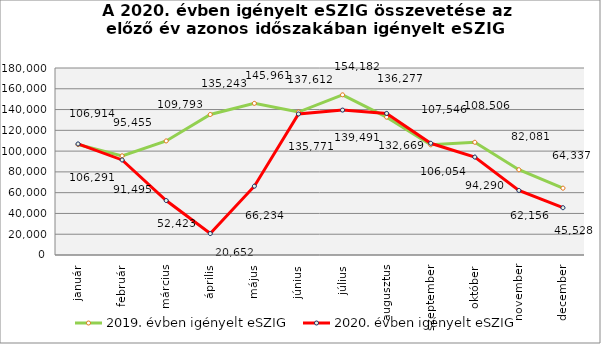
| Category | 2019. évben igényelt eSZIG | 2020. évben igényelt eSZIG |
|---|---|---|
| január | 106291 | 106914 |
| február | 95455 | 91495 |
| március | 109793 | 52423 |
| április | 135243 | 20652 |
| május | 145961 | 66234 |
| június | 137612 | 135771 |
| július | 154182 | 139491 |
| augusztus | 132669 | 136277 |
| szeptember | 106054 | 107546 |
| október | 108506 | 94290 |
| november | 82081 | 62156 |
| december | 64337 | 45528 |